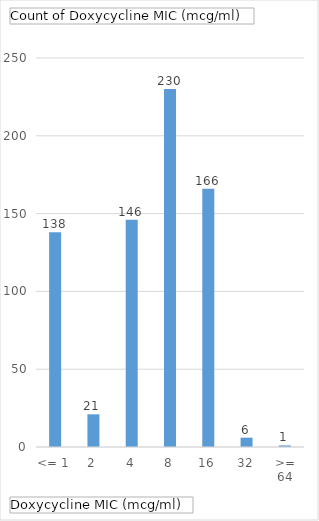
| Category | Total |
|---|---|
| <= 1 | 138 |
| 2 | 21 |
| 4 | 146 |
| 8 | 230 |
| 16 | 166 |
| 32 | 6 |
| >= 64 | 1 |